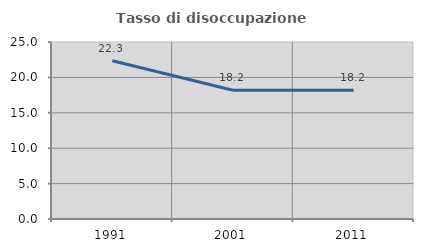
| Category | Tasso di disoccupazione giovanile  |
|---|---|
| 1991.0 | 22.34 |
| 2001.0 | 18.182 |
| 2011.0 | 18.182 |